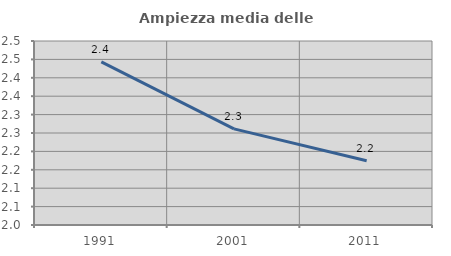
| Category | Ampiezza media delle famiglie |
|---|---|
| 1991.0 | 2.443 |
| 2001.0 | 2.261 |
| 2011.0 | 2.175 |